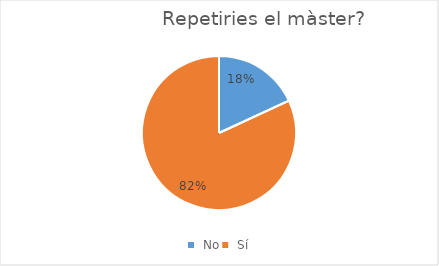
| Category | Series 0 |
|---|---|
|  No | 21 |
|  Sí | 95 |